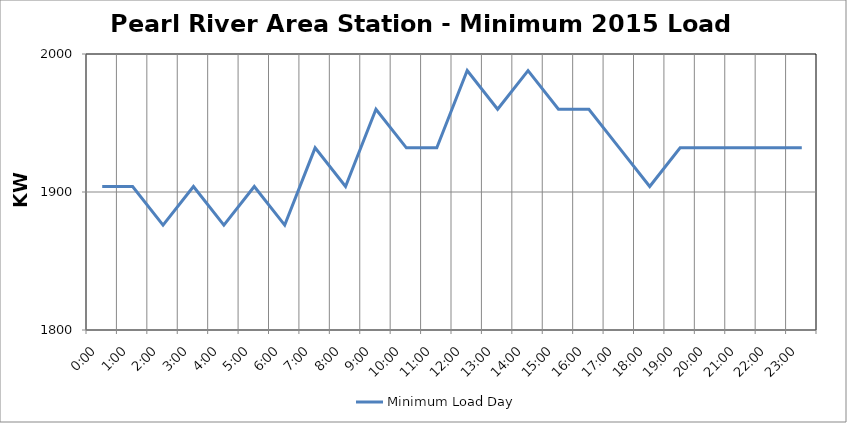
| Category | Minimum Load Day |
|---|---|
| 0.0 | 1904 |
| 0.041666666666666664 | 1904 |
| 0.08333333333333333 | 1876 |
| 0.125 | 1904 |
| 0.16666666666666666 | 1876 |
| 0.20833333333333334 | 1904 |
| 0.25 | 1876 |
| 0.2916666666666667 | 1932 |
| 0.3333333333333333 | 1904 |
| 0.375 | 1960 |
| 0.4166666666666667 | 1932 |
| 0.4583333333333333 | 1932 |
| 0.5 | 1988 |
| 0.5416666666666666 | 1960 |
| 0.5833333333333334 | 1988 |
| 0.625 | 1960 |
| 0.6666666666666666 | 1960 |
| 0.7083333333333334 | 1932 |
| 0.75 | 1904 |
| 0.7916666666666666 | 1932 |
| 0.8333333333333334 | 1932 |
| 0.875 | 1932 |
| 0.9166666666666666 | 1932 |
| 0.9583333333333334 | 1932 |